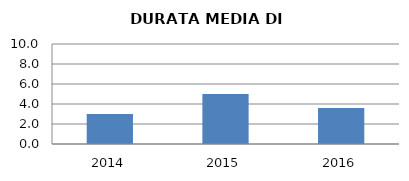
| Category | 2014 2015 2016 |
|---|---|
| 2014.0 | 3 |
| 2015.0 | 5 |
| 2016.0 | 3.6 |